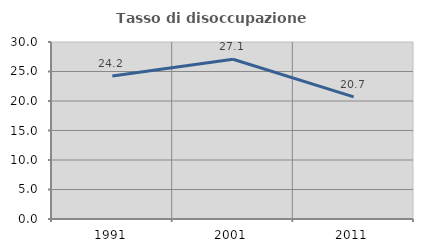
| Category | Tasso di disoccupazione giovanile  |
|---|---|
| 1991.0 | 24.242 |
| 2001.0 | 27.083 |
| 2011.0 | 20.69 |